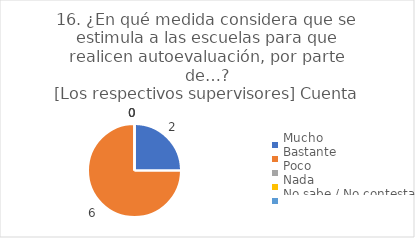
| Category | 16. ¿En qué medida considera que se estimula a las escuelas para que realicen autoevaluación, por parte de…?
[Los respectivos supervisores] |
|---|---|
| Mucho  | 0.25 |
| Bastante  | 0.75 |
| Poco  | 0 |
| Nada  | 0 |
| No sabe / No contesta | 0 |